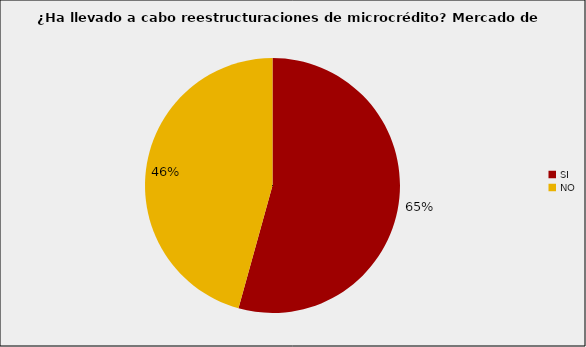
| Category | Mercado de Microcrédito |
|---|---|
| SI | 0.543 |
| NO | 0.457 |